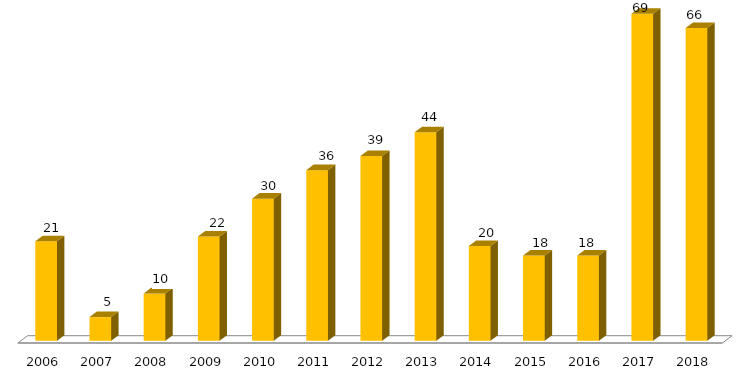
| Category | Concluídos*** |
|---|---|
| 2006.0 | 21 |
| 2007.0 | 5 |
| 2008.0 | 10 |
| 2009.0 | 22 |
| 2010.0 | 30 |
| 2011.0 | 36 |
| 2012.0 | 39 |
| 2013.0 | 44 |
| 2014.0 | 20 |
| 2015.0 | 18 |
| 2016.0 | 18 |
| 2017.0 | 69 |
| 2018.0 | 66 |